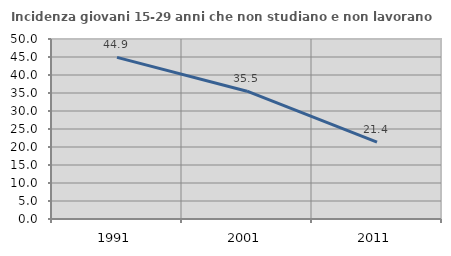
| Category | Incidenza giovani 15-29 anni che non studiano e non lavorano  |
|---|---|
| 1991.0 | 44.906 |
| 2001.0 | 35.501 |
| 2011.0 | 21.366 |